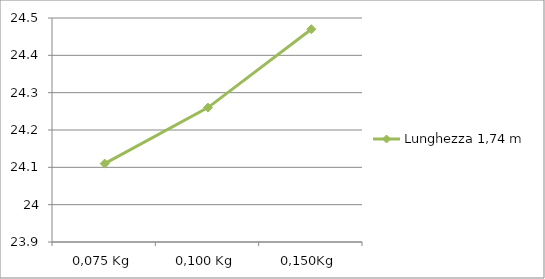
| Category | Lunghezza 1,74 m |
|---|---|
| 0,075 Kg | 24.11 |
| 0,100 Kg | 24.26 |
| 0,150Kg | 24.47 |